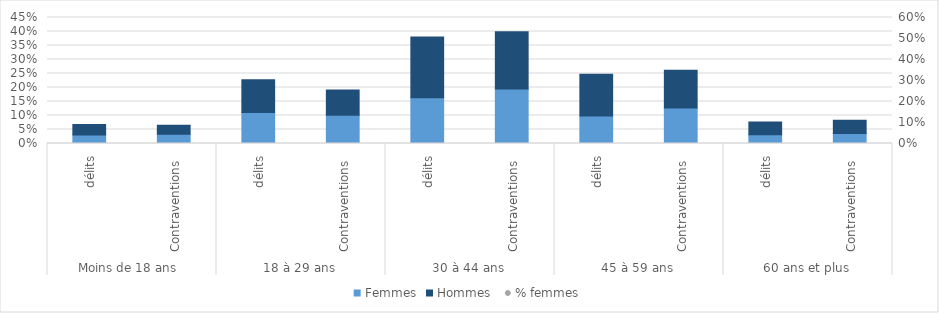
| Category | Femmes | Hommes  |
|---|---|---|
| 0 | 0.03 | 0.037 |
| 1 | 0.033 | 0.033 |
| 2 | 0.111 | 0.117 |
| 3 | 0.101 | 0.09 |
| 4 | 0.163 | 0.217 |
| 5 | 0.194 | 0.205 |
| 6 | 0.098 | 0.149 |
| 7 | 0.127 | 0.135 |
| 8 | 0.031 | 0.045 |
| 9 | 0.036 | 0.047 |